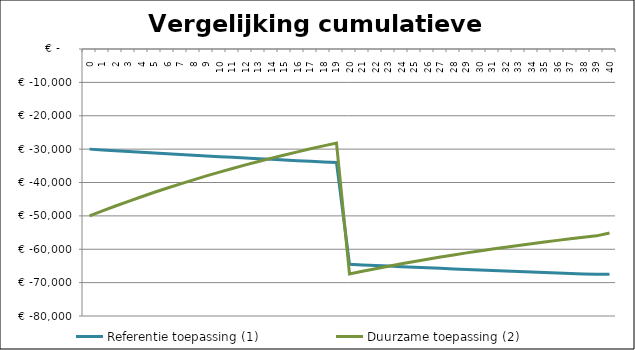
| Category | Referentie toepassing (1) | Duurzame toepassing (2) |
|---|---|---|
| 0.0 | -30000 | -50000 |
| 1.0 | -30240.385 | -48509.615 |
| 2.0 | -30477.302 | -47048.881 |
| 3.0 | -30710.803 | -45633.701 |
| 4.0 | -30940.935 | -44262.711 |
| 5.0 | -31167.749 | -42934.588 |
| 6.0 | -31391.291 | -41648.047 |
| 7.0 | -31611.609 | -40401.842 |
| 8.0 | -31828.749 | -39194.764 |
| 9.0 | -32042.757 | -38025.636 |
| 10.0 | -32253.679 | -36893.32 |
| 11.0 | -32461.559 | -35796.71 |
| 12.0 | -32666.44 | -34734.73 |
| 13.0 | -32868.366 | -33706.34 |
| 14.0 | -33067.38 | -32710.527 |
| 15.0 | -33263.524 | -31746.31 |
| 16.0 | -33456.839 | -30812.735 |
| 17.0 | -33647.365 | -29908.879 |
| 18.0 | -33835.143 | -29033.844 |
| 19.0 | -34020.213 | -28186.759 |
| 20.0 | -64516.679 | -67378.63 |
| 21.0 | -64696.449 | -66584.933 |
| 22.0 | -64873.626 | -65816.724 |
| 23.0 | -65048.248 | -65073.23 |
| 24.0 | -65220.351 | -64353.702 |
| 25.0 | -65389.972 | -63657.412 |
| 26.0 | -65557.146 | -62983.653 |
| 27.0 | -65721.909 | -62331.741 |
| 28.0 | -65884.296 | -61701.011 |
| 29.0 | -66044.341 | -61090.816 |
| 30.0 | -66202.077 | -60500.532 |
| 31.0 | -66357.539 | -59929.55 |
| 32.0 | -66510.758 | -59377.282 |
| 33.0 | -66661.767 | -58843.153 |
| 34.0 | -66810.598 | -58326.611 |
| 35.0 | -66957.283 | -57827.115 |
| 36.0 | -67101.852 | -57344.144 |
| 37.0 | -67244.336 | -56877.189 |
| 38.0 | -67384.764 | -56425.76 |
| 39.0 | -67523.168 | -55989.377 |
| 40.0 | -67521.602 | -55107.669 |